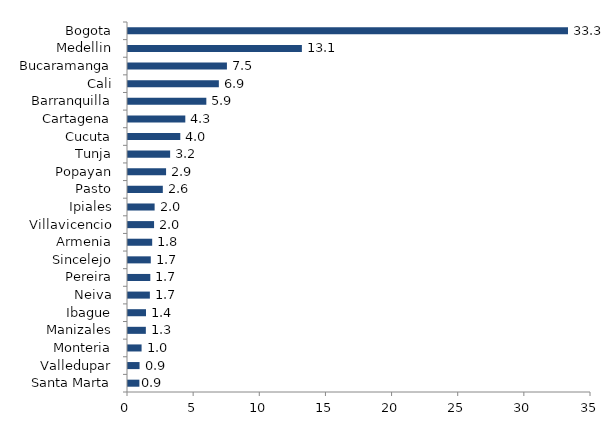
| Category | Series 0 |
|---|---|
| Santa Marta | 0.86 |
| Valledupar | 0.873 |
| Monteria | 1.027 |
| Manizales | 1.349 |
| Ibague | 1.363 |
| Neiva | 1.653 |
| Pereira | 1.687 |
| Sincelejo | 1.722 |
| Armenia | 1.829 |
| Villavicencio | 1.971 |
| Ipiales | 2.012 |
| Pasto | 2.632 |
| Popayan | 2.878 |
| Tunja | 3.185 |
| Cucuta | 3.953 |
| Cartagena | 4.332 |
| Barranquilla | 5.922 |
| Cali | 6.868 |
| Bucaramanga | 7.478 |
| Medellin | 13.145 |
| Bogota | 33.261 |